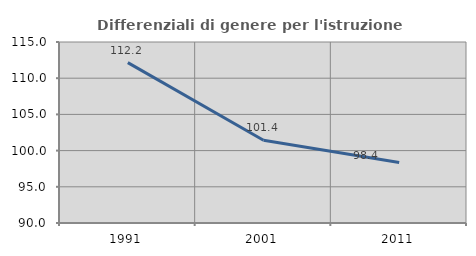
| Category | Differenziali di genere per l'istruzione superiore |
|---|---|
| 1991.0 | 112.15 |
| 2001.0 | 101.429 |
| 2011.0 | 98.354 |